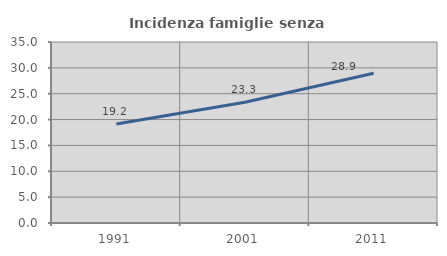
| Category | Incidenza famiglie senza nuclei |
|---|---|
| 1991.0 | 19.162 |
| 2001.0 | 23.342 |
| 2011.0 | 28.944 |